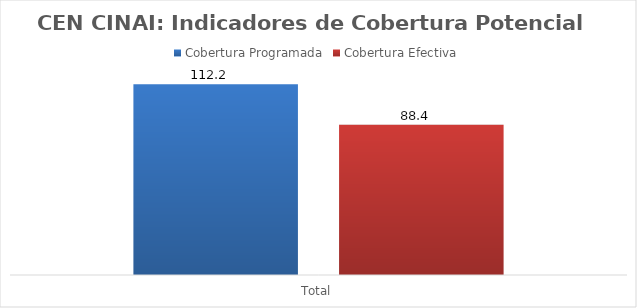
| Category | Cobertura Programada | Cobertura Efectiva |
|---|---|---|
| Total | 112.215 | 88.41 |